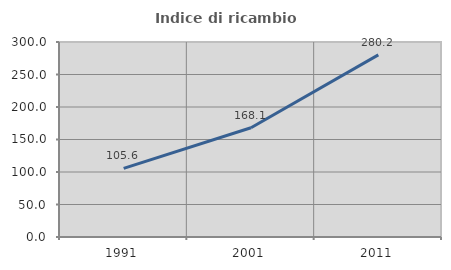
| Category | Indice di ricambio occupazionale  |
|---|---|
| 1991.0 | 105.587 |
| 2001.0 | 168.056 |
| 2011.0 | 280.165 |